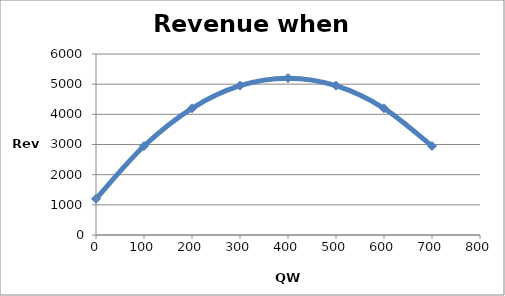
| Category | Series 0 |
|---|---|
| 0.0 | 1200 |
| 100.0 | 2950 |
| 200.0 | 4200 |
| 300.0 | 4950 |
| 400.0 | 5200 |
| 500.0 | 4950 |
| 600.0 | 4200 |
| 700.0 | 2950 |